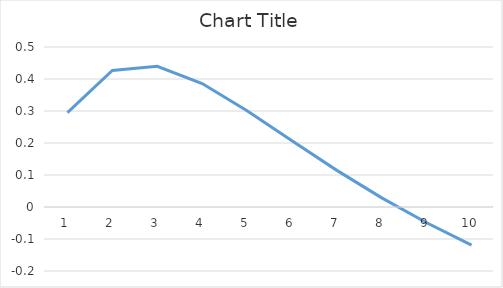
| Category | Series 0 |
|---|---|
| 0 | 0.295 |
| 1 | 0.427 |
| 2 | 0.44 |
| 3 | 0.386 |
| 4 | 0.301 |
| 5 | 0.207 |
| 6 | 0.114 |
| 7 | 0.029 |
| 8 | -0.049 |
| 9 | -0.119 |